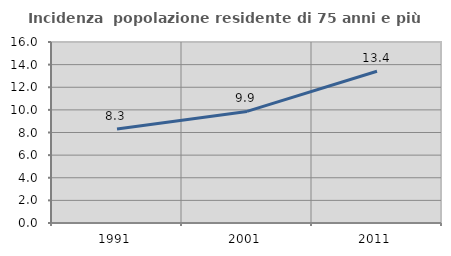
| Category | Incidenza  popolazione residente di 75 anni e più |
|---|---|
| 1991.0 | 8.317 |
| 2001.0 | 9.866 |
| 2011.0 | 13.416 |